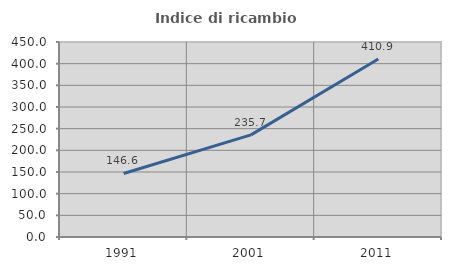
| Category | Indice di ricambio occupazionale  |
|---|---|
| 1991.0 | 146.638 |
| 2001.0 | 235.694 |
| 2011.0 | 410.902 |